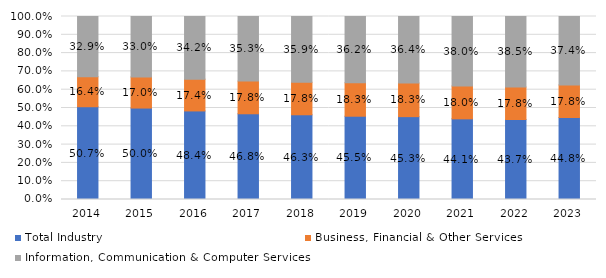
| Category | Total Industry | Business, Financial & Other Services | Information, Communication & Computer Services |
|---|---|---|---|
| 2014 | 0.507 | 0.164 | 0.329 |
| 2015 | 0.5 | 0.17 | 0.33 |
| 2016 | 0.484 | 0.174 | 0.342 |
| 2017 | 0.468 | 0.178 | 0.353 |
| 2018 | 0.463 | 0.178 | 0.359 |
| 2019 | 0.455 | 0.183 | 0.362 |
| 2020 | 0.453 | 0.183 | 0.364 |
| 2021 | 0.441 | 0.18 | 0.38 |
| 2022 | 0.437 | 0.178 | 0.385 |
| 2023 | 0.448 | 0.178 | 0.374 |